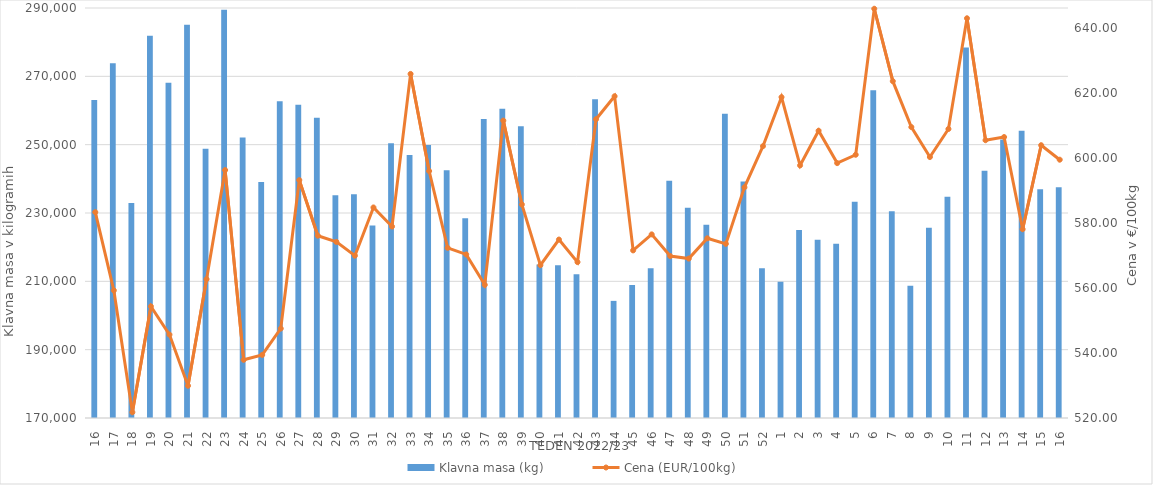
| Category | Klavna masa (kg) |
|---|---|
| 16.0 | 263098 |
| 17.0 | 273824 |
| 18.0 | 232926 |
| 19.0 | 281859 |
| 20.0 | 268153 |
| 21.0 | 285073 |
| 22.0 | 248783 |
| 23.0 | 289478 |
| 24.0 | 252069 |
| 25.0 | 239099 |
| 26.0 | 262689 |
| 27.0 | 261656 |
| 28.0 | 257905 |
| 29.0 | 235185 |
| 30.0 | 235475 |
| 31.0 | 226322 |
| 32.0 | 250418 |
| 33.0 | 246996 |
| 34.0 | 249873 |
| 35.0 | 242516 |
| 36.0 | 228469 |
| 37.0 | 257511 |
| 38.0 | 260481 |
| 39.0 | 255370 |
| 40.0 | 214936 |
| 41.0 | 214672 |
| 42.0 | 212066 |
| 43.0 | 263287 |
| 44.0 | 204280 |
| 45.0 | 208920 |
| 46.0 | 213836 |
| 47.0 | 239417 |
| 48.0 | 231565 |
| 49.0 | 226575 |
| 50.0 | 259073 |
| 51.0 | 239211 |
| 52.0 | 213841 |
| 1.0 | 209877 |
| 2.0 | 225045 |
| 3.0 | 222198 |
| 4.0 | 221002 |
| 5.0 | 233306 |
| 6.0 | 265944 |
| 7.0 | 230531 |
| 8.0 | 208699 |
| 9.0 | 225712 |
| 10.0 | 234762 |
| 11.0 | 278467 |
| 12.0 | 242369 |
| 13.0 | 251507 |
| 14.0 | 254072 |
| 15.0 | 236964 |
| 16.0 | 237552 |